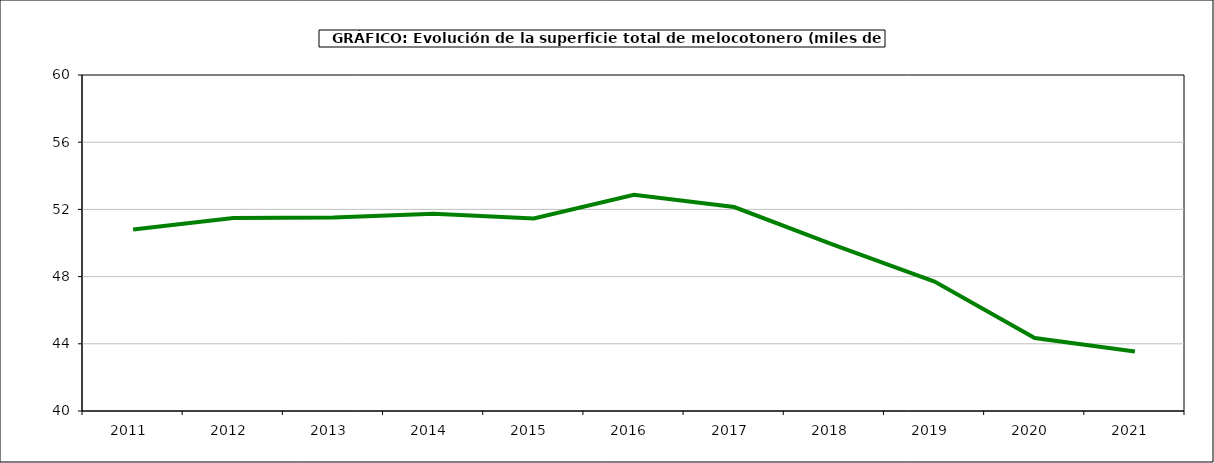
| Category | superficie melocotonero |
|---|---|
| 2011.0 | 50.805 |
| 2012.0 | 51.491 |
| 2013.0 | 51.511 |
| 2014.0 | 51.746 |
| 2015.0 | 51.458 |
| 2016.0 | 52.875 |
| 2017.0 | 52.141 |
| 2018.0 | 49.868 |
| 2019.0 | 47.707 |
| 2020.0 | 44.348 |
| 2021.0 | 43.547 |